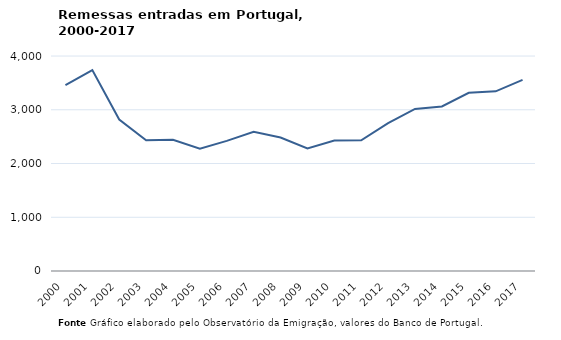
| Category | Entradas |
|---|---|
| 2000.0 | 3458.12 |
| 2001.0 | 3736.82 |
| 2002.0 | 2817.88 |
| 2003.0 | 2433.78 |
| 2004.0 | 2442.16 |
| 2005.0 | 2277.25 |
| 2006.0 | 2420.27 |
| 2007.0 | 2588.42 |
| 2008.0 | 2484.68 |
| 2009.0 | 2281.87 |
| 2010.0 | 2425.9 |
| 2011.0 | 2430.49 |
| 2012.0 | 2749.46 |
| 2013.0 | 3015.78 |
| 2014.0 | 3060.71 |
| 2015.0 | 3315.62 |
| 2016.0 | 3343.2 |
| 2017.0 | 3554.75 |